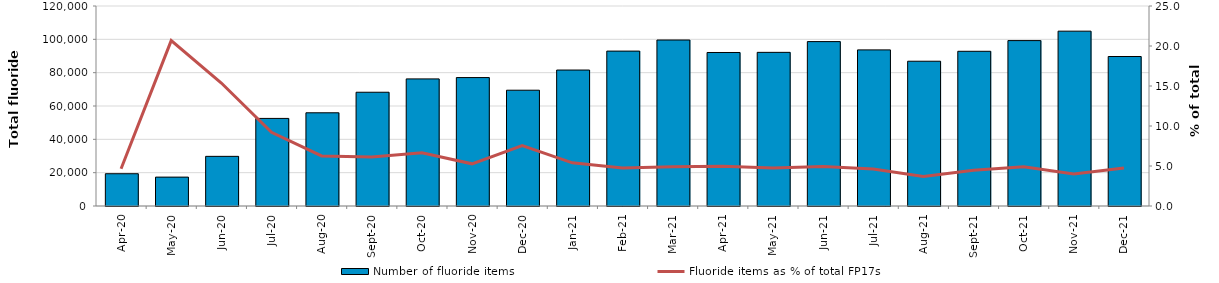
| Category | Number of fluoride items |
|---|---|
| 2020-04-01 | 19361 |
| 2020-05-01 | 17327 |
| 2020-06-01 | 29790 |
| 2020-07-01 | 52552 |
| 2020-08-01 | 55929 |
| 2020-09-01 | 68257 |
| 2020-10-01 | 76261 |
| 2020-11-01 | 77058 |
| 2020-12-01 | 69472 |
| 2021-01-01 | 81573 |
| 2021-02-01 | 92941 |
| 2021-03-01 | 99598 |
| 2021-04-01 | 92101 |
| 2021-05-01 | 92191 |
| 2021-06-01 | 98641 |
| 2021-07-01 | 93671 |
| 2021-08-01 | 86865 |
| 2021-09-01 | 92827 |
| 2021-10-01 | 99238 |
| 2021-11-01 | 104904 |
| 2021-12-01 | 89691 |